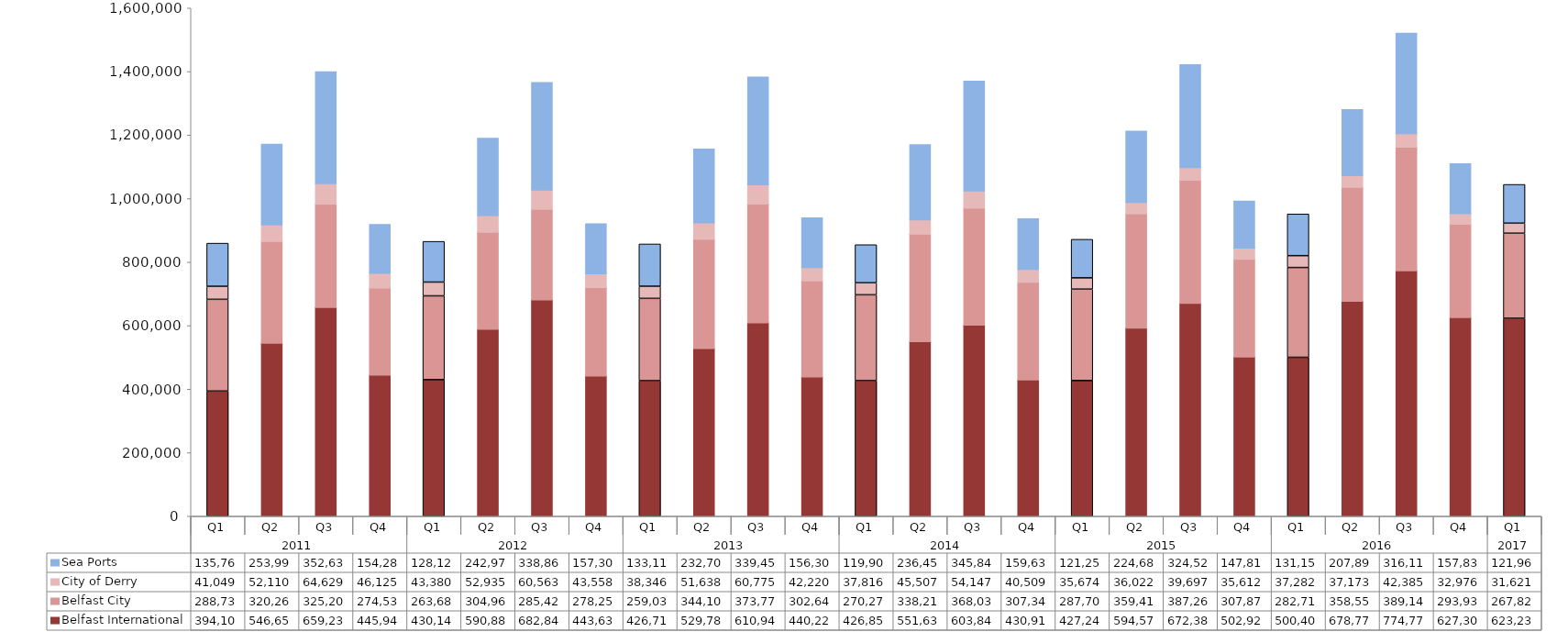
| Category | Belfast International  | Belfast City  | City of Derry | Sea Ports  |
|---|---|---|---|---|
| 0 | 394100 | 288733 | 41049 | 135765 |
| 1 | 546651 | 320268 | 52110 | 253996 |
| 2 | 659236 | 325208 | 64629 | 352634 |
| 3 | 445944 | 274534 | 46125 | 154289 |
| 4 | 430140 | 263681 | 43380 | 128126 |
| 5 | 590889 | 304966 | 52935 | 242979 |
| 6 | 682848 | 285428 | 60563 | 338862 |
| 7 | 443634 | 278255 | 43558 | 157300 |
| 8 | 426712 | 259035 | 38346 | 133115 |
| 9 | 529784 | 344108 | 51638 | 232700 |
| 10 | 610949 | 373771 | 60775 | 339454 |
| 11 | 440220 | 302642 | 42220 | 156301 |
| 12 | 426851 | 270276 | 37816 | 119908 |
| 13 | 551638 | 338216 | 45507 | 236452 |
| 14 | 603845 | 368032 | 54147 | 345849 |
| 15 | 430917 | 307349 | 40509 | 159639 |
| 16 | 427248 | 287709 | 35674 | 121250 |
| 17 | 594579 | 359411 | 36022 | 224689 |
| 18 | 672387 | 387267 | 39697 | 324526 |
| 19 | 502921 | 307873 | 35612 | 147811 |
| 20 | 500402 | 282712 | 37282 | 131151 |
| 21 | 678774 | 358552 | 37173 | 207894 |
| 22 | 774778 | 389141 | 42385 | 316118 |
| 23 | 627303 | 293936 | 32976 | 157838 |
| 24 | 623232 | 267825 | 31621 | 121961 |